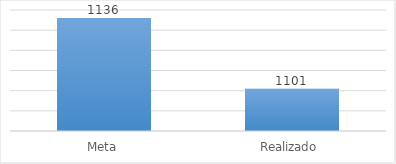
| Category | Series 0 |
|---|---|
| Meta | 1136 |
| Realizado | 1101 |